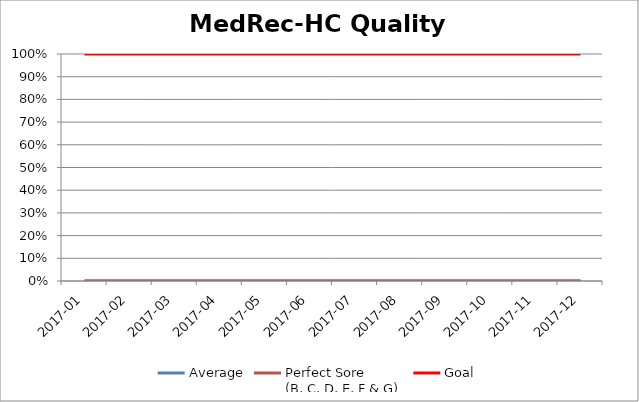
| Category | Average | Perfect Sore 
(B, C, D, E, F & G) | Goal |
|---|---|---|---|
| 2017-01 | 0 | 0 | 1 |
| 2017-02 | 0 | 0 | 1 |
| 2017-03 | 0 | 0 | 1 |
| 2017-04 | 0 | 0 | 1 |
| 2017-05 | 0 | 0 | 1 |
| 2017-06 | 0 | 0 | 1 |
| 2017-07 | 0 | 0 | 1 |
| 2017-08 | 0 | 0 | 1 |
| 2017-09 | 0 | 0 | 1 |
| 2017-10 | 0 | 0 | 1 |
| 2017-11 | 0 | 0 | 1 |
| 2017-12 | 0 | 0 | 1 |